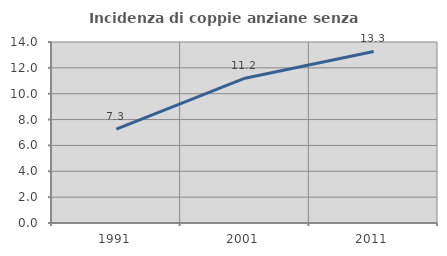
| Category | Incidenza di coppie anziane senza figli  |
|---|---|
| 1991.0 | 7.256 |
| 2001.0 | 11.201 |
| 2011.0 | 13.265 |